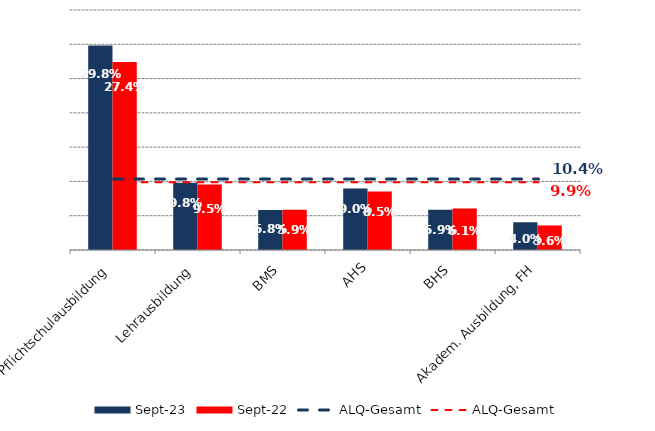
| Category | Sep 23 | Sep 22 |
|---|---|---|
| Pflichtschulausbildung | 0.298 | 0.274 |
| Lehrausbildung | 0.098 | 0.095 |
| BMS | 0.058 | 0.059 |
| AHS | 0.09 | 0.085 |
| BHS | 0.059 | 0.061 |
| Akadem. Ausbildung, FH | 0.04 | 0.036 |